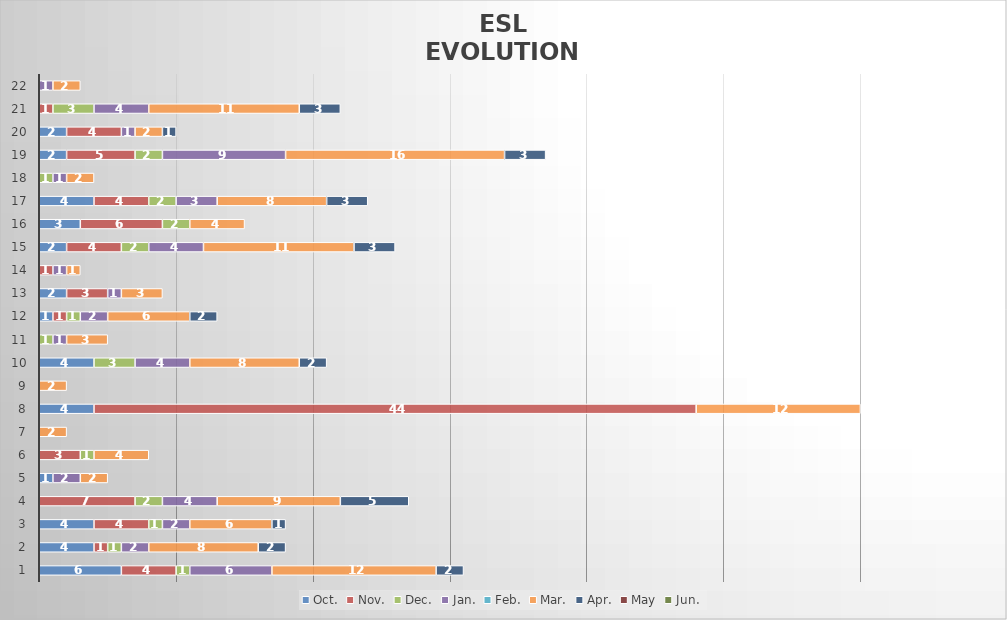
| Category | Oct. | Nov. | Dec. | Jan. | Feb. | Mar. | Apr. | May | Jun. |
|---|---|---|---|---|---|---|---|---|---|
| 1.0 | 6 | 4 | 1 | 6 | 0 | 12 | 2 | 0 | 0 |
| 2.0 | 4 | 1 | 1 | 2 | 0 | 8 | 2 | 0 | 0 |
| 3.0 | 4 | 4 | 1 | 2 | 0 | 6 | 1 | 0 | 0 |
| 4.0 | 0 | 7 | 2 | 4 | 0 | 9 | 5 | 0 | 0 |
| 5.0 | 1 | 0 | 0 | 2 | 0 | 2 | 0 | 0 | 0 |
| 6.0 | 0 | 3 | 1 | 0 | 0 | 4 | 0 | 0 | 0 |
| 7.0 | 0 | 0 | 0 | 0 | 0 | 2 | 0 | 0 | 0 |
| 8.0 | 4 | 44 | 0 | 0 | 0 | 12 | 0 | 0 | 0 |
| 9.0 | 0 | 0 | 0 | 0 | 0 | 2 | 0 | 0 | 0 |
| 10.0 | 4 | 0 | 3 | 4 | 0 | 8 | 2 | 0 | 0 |
| 11.0 | 0 | 0 | 1 | 1 | 0 | 3 | 0 | 0 | 0 |
| 12.0 | 1 | 1 | 1 | 2 | 0 | 6 | 2 | 0 | 0 |
| 13.0 | 2 | 3 | 0 | 1 | 0 | 3 | 0 | 0 | 0 |
| 14.0 | 0 | 1 | 0 | 1 | 0 | 1 | 0 | 0 | 0 |
| 15.0 | 2 | 4 | 2 | 4 | 0 | 11 | 3 | 0 | 0 |
| 16.0 | 3 | 6 | 2 | 0 | 0 | 4 | 0 | 0 | 0 |
| 17.0 | 4 | 4 | 2 | 3 | 0 | 8 | 3 | 0 | 0 |
| 18.0 | 0 | 0 | 1 | 1 | 0 | 2 | 0 | 0 | 0 |
| 19.0 | 2 | 5 | 2 | 9 | 0 | 16 | 3 | 0 | 0 |
| 20.0 | 2 | 4 | 0 | 1 | 0 | 2 | 1 | 0 | 0 |
| 21.0 | 0 | 1 | 3 | 4 | 0 | 11 | 3 | 0 | 0 |
| 22.0 | 0 | 0 | 0 | 1 | 0 | 2 | 0 | 0 | 0 |